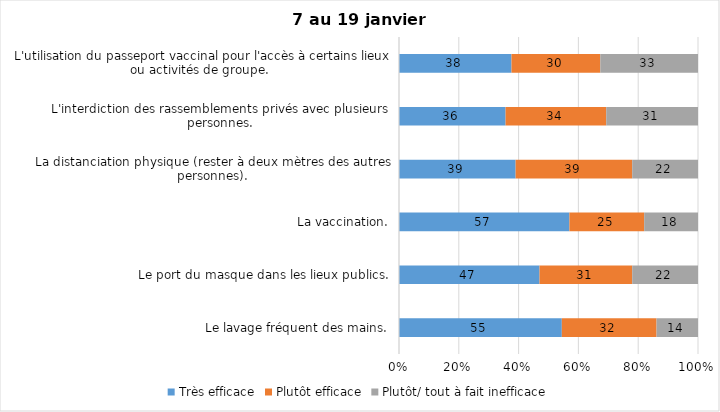
| Category | Très efficace | Plutôt efficace | Plutôt/ tout à fait inefficace |
|---|---|---|---|
| Le lavage fréquent des mains. | 55 | 32 | 14 |
| Le port du masque dans les lieux publics. | 47 | 31 | 22 |
| La vaccination. | 57 | 25 | 18 |
| La distanciation physique (rester à deux mètres des autres personnes). | 39 | 39 | 22 |
| L'interdiction des rassemblements privés avec plusieurs personnes. | 36 | 34 | 31 |
| L'utilisation du passeport vaccinal pour l'accès à certains lieux ou activités de groupe.  | 38 | 30 | 33 |